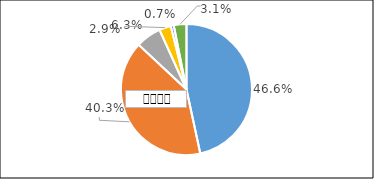
| Category | Series 0 |
|---|---|
| 0 | 0.466 |
| 1 | 0.403 |
| 2 | 0.063 |
| 3 | 0.029 |
| 4 | 0.007 |
| 5 | 0.031 |